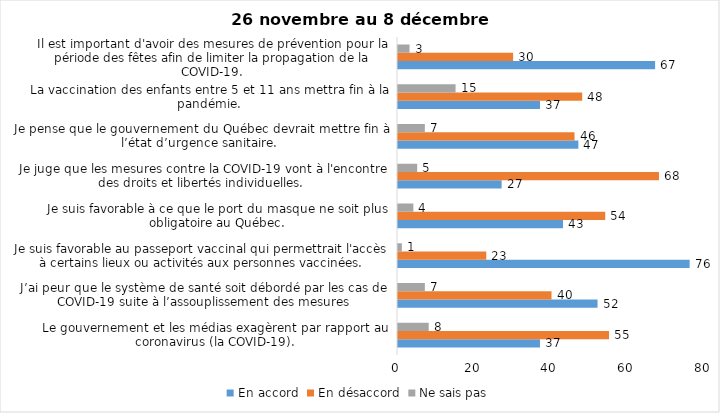
| Category | En accord | En désaccord | Ne sais pas |
|---|---|---|---|
| Le gouvernement et les médias exagèrent par rapport au coronavirus (la COVID-19). | 37 | 55 | 8 |
| J’ai peur que le système de santé soit débordé par les cas de COVID-19 suite à l’assouplissement des mesures | 52 | 40 | 7 |
| Je suis favorable au passeport vaccinal qui permettrait l'accès à certains lieux ou activités aux personnes vaccinées. | 76 | 23 | 1 |
| Je suis favorable à ce que le port du masque ne soit plus obligatoire au Québec. | 43 | 54 | 4 |
| Je juge que les mesures contre la COVID-19 vont à l'encontre des droits et libertés individuelles.  | 27 | 68 | 5 |
| Je pense que le gouvernement du Québec devrait mettre fin à l’état d’urgence sanitaire.  | 47 | 46 | 7 |
| La vaccination des enfants entre 5 et 11 ans mettra fin à la pandémie. | 37 | 48 | 15 |
| Il est important d'avoir des mesures de prévention pour la période des fêtes afin de limiter la propagation de la COVID-19. | 67 | 30 | 3 |